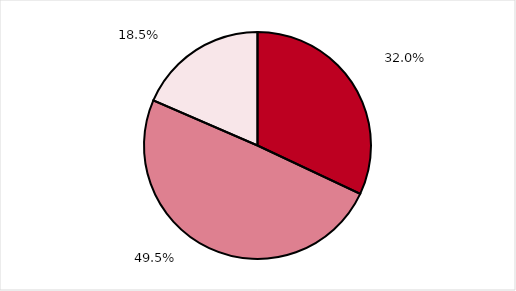
| Category | Series 0 |
|---|---|
| Ja | 0.32 |
| Nein | 0.495 |
| Weiß nicht | 0.185 |